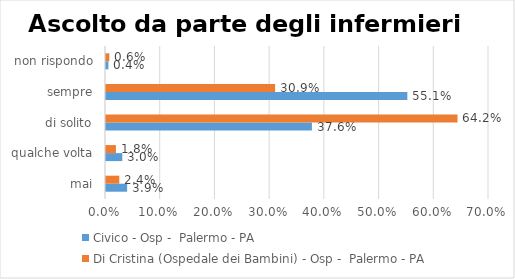
| Category | Civico - Osp -  Palermo - PA | Di Cristina (Ospedale dei Bambini) - Osp -  Palermo - PA |
|---|---|---|
| mai | 0.039 | 0.024 |
| qualche volta | 0.03 | 0.018 |
| di solito | 0.376 | 0.642 |
| sempre | 0.551 | 0.309 |
| non rispondo | 0.004 | 0.006 |